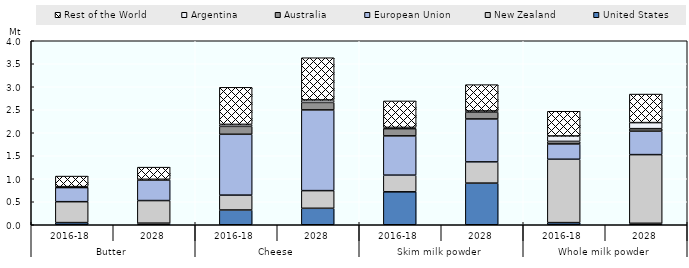
| Category | United States | New Zealand | European Union | Australia | Argentina | Rest of the World |
|---|---|---|---|---|---|---|
| 0 | 0.047 | 0.455 | 0.307 | 0.016 | 0.005 | 0.229 |
| 1 | 0.035 | 0.491 | 0.45 | 0.006 | 0.006 | 0.264 |
| 2 | 0.321 | 0.323 | 1.323 | 0.173 | 0.043 | 0.806 |
| 3 | 0.358 | 0.384 | 1.755 | 0.162 | 0.053 | 0.918 |
| 4 | 0.716 | 0.362 | 0.854 | 0.157 | 0.027 | 0.576 |
| 5 | 0.906 | 0.461 | 0.933 | 0.149 | 0.025 | 0.573 |
| 6 | 0.046 | 1.378 | 0.333 | 0.055 | 0.118 | 0.537 |
| 7 | 0.032 | 1.493 | 0.509 | 0.055 | 0.132 | 0.62 |